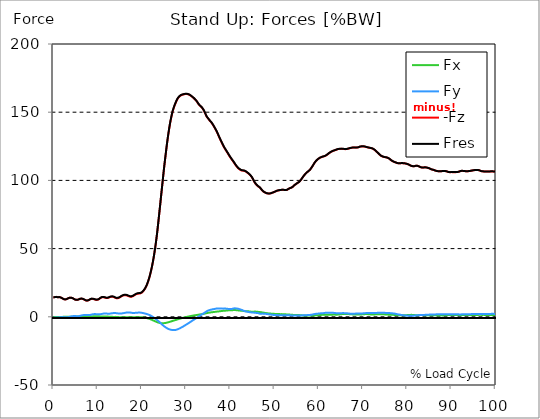
| Category |  Fx |  Fy |  -Fz |  Fres |
|---|---|---|---|---|
| 0.0 | -0.107 | -0.724 | 14.162 | 14.188 |
| 0.167348456675344 | -0.114 | -0.683 | 14.264 | 14.287 |
| 0.334696913350688 | -0.144 | -0.649 | 14.45 | 14.47 |
| 0.5020453700260321 | -0.171 | -0.605 | 14.592 | 14.609 |
| 0.669393826701376 | -0.187 | -0.534 | 14.599 | 14.614 |
| 0.83674228337672 | -0.166 | -0.531 | 14.439 | 14.454 |
| 1.0040907400520642 | -0.154 | -0.533 | 14.33 | 14.344 |
| 1.1621420602454444 | -0.182 | -0.474 | 14.438 | 14.451 |
| 1.3294905169207885 | -0.199 | -0.408 | 14.47 | 14.481 |
| 1.4968389735961325 | -0.197 | -0.34 | 14.371 | 14.381 |
| 1.6641874302714765 | -0.179 | -0.288 | 14.18 | 14.189 |
| 1.8315358869468206 | -0.147 | -0.26 | 13.936 | 13.944 |
| 1.9988843436221646 | -0.1 | -0.221 | 13.594 | 13.601 |
| 2.1662328002975086 | -0.04 | -0.238 | 13.245 | 13.251 |
| 2.333581256972853 | 0.018 | -0.288 | 12.956 | 12.964 |
| 2.5009297136481967 | 0.063 | -0.363 | 12.768 | 12.779 |
| 2.6682781703235405 | 0.088 | -0.407 | 12.723 | 12.736 |
| 2.8356266269988843 | 0.109 | -0.44 | 12.802 | 12.815 |
| 3.002975083674229 | 0.114 | -0.424 | 12.967 | 12.981 |
| 3.1703235403495724 | 0.109 | -0.379 | 13.236 | 13.249 |
| 3.337671997024917 | 0.078 | -0.276 | 13.558 | 13.568 |
| 3.4957233172182973 | 0.043 | -0.164 | 13.837 | 13.845 |
| 3.663071773893641 | 0.021 | -0.018 | 13.981 | 13.989 |
| 3.8304202305689854 | 0.006 | 0.131 | 14.072 | 14.079 |
| 3.997768687244329 | 0.004 | 0.26 | 14.024 | 14.035 |
| 4.165117143919673 | 0.011 | 0.356 | 13.891 | 13.903 |
| 4.332465600595017 | 0.025 | 0.455 | 13.682 | 13.698 |
| 4.499814057270361 | 0.049 | 0.512 | 13.402 | 13.421 |
| 4.667162513945706 | 0.089 | 0.543 | 13.047 | 13.071 |
| 4.834510970621049 | 0.129 | 0.554 | 12.739 | 12.766 |
| 5.001859427296393 | 0.166 | 0.518 | 12.52 | 12.547 |
| 5.169207883971737 | 0.201 | 0.472 | 12.37 | 12.397 |
| 5.336556340647081 | 0.222 | 0.436 | 12.383 | 12.411 |
| 5.503904797322425 | 0.231 | 0.418 | 12.464 | 12.493 |
| 5.671253253997769 | 0.235 | 0.438 | 12.632 | 12.663 |
| 5.82930457419115 | 0.22 | 0.526 | 12.882 | 12.917 |
| 5.996653030866494 | 0.202 | 0.669 | 13.136 | 13.181 |
| 6.164001487541838 | 0.184 | 0.813 | 13.264 | 13.319 |
| 6.331349944217181 | 0.17 | 0.947 | 13.323 | 13.385 |
| 6.498698400892526 | 0.173 | 1.074 | 13.236 | 13.307 |
| 6.66604685756787 | 0.183 | 1.193 | 13.105 | 13.186 |
| 6.833395314243213 | 0.204 | 1.268 | 12.893 | 12.983 |
| 7.000743770918558 | 0.237 | 1.333 | 12.607 | 12.702 |
| 7.168092227593902 | 0.278 | 1.326 | 12.28 | 12.377 |
| 7.335440684269246 | 0.317 | 1.312 | 11.971 | 12.069 |
| 7.50278914094459 | 0.337 | 1.28 | 11.872 | 11.968 |
| 7.6701375976199335 | 0.347 | 1.239 | 11.86 | 11.953 |
| 7.837486054295278 | 0.353 | 1.253 | 11.959 | 12.05 |
| 7.995537374488658 | 0.352 | 1.25 | 12.182 | 12.272 |
| 8.162885831164003 | 0.339 | 1.294 | 12.497 | 12.591 |
| 8.330234287839346 | 0.319 | 1.399 | 12.842 | 12.945 |
| 8.49758274451469 | 0.303 | 1.521 | 13.114 | 13.23 |
| 8.664931201190035 | 0.305 | 1.652 | 13.19 | 13.322 |
| 8.832279657865378 | 0.307 | 1.779 | 13.176 | 13.325 |
| 8.999628114540721 | 0.317 | 1.887 | 13.098 | 13.264 |
| 9.166976571216066 | 0.328 | 1.962 | 12.948 | 13.127 |
| 9.334325027891412 | 0.346 | 2.001 | 12.732 | 12.919 |
| 9.501673484566755 | 0.36 | 1.984 | 12.499 | 12.687 |
| 9.669021941242098 | 0.366 | 1.95 | 12.393 | 12.578 |
| 9.836370397917442 | 0.371 | 1.895 | 12.356 | 12.534 |
| 10.003718854592787 | 0.366 | 1.864 | 12.453 | 12.626 |
| 10.17106731126813 | 0.35 | 1.839 | 12.673 | 12.84 |
| 10.329118631461512 | 0.331 | 1.845 | 12.986 | 13.155 |
| 10.496467088136853 | 0.308 | 1.862 | 13.392 | 13.56 |
| 10.663815544812199 | 0.28 | 1.9 | 13.822 | 13.995 |
| 10.831164001487544 | 0.259 | 1.993 | 14.116 | 14.297 |
| 10.998512458162887 | 0.243 | 2.107 | 14.289 | 14.484 |
| 11.16586091483823 | 0.239 | 2.23 | 14.353 | 14.566 |
| 11.333209371513574 | 0.24 | 2.332 | 14.329 | 14.557 |
| 11.50055782818892 | 0.242 | 2.404 | 14.236 | 14.478 |
| 11.667906284864264 | 0.246 | 2.43 | 14.051 | 14.302 |
| 11.835254741539607 | 0.24 | 2.417 | 13.871 | 14.122 |
| 12.00260319821495 | 0.225 | 2.379 | 13.75 | 13.996 |
| 12.169951654890292 | 0.199 | 2.313 | 13.757 | 13.989 |
| 12.337300111565641 | 0.165 | 2.271 | 13.85 | 14.07 |
| 12.504648568240984 | 0.124 | 2.261 | 14.032 | 14.245 |
| 12.662699888434362 | 0.08 | 2.279 | 14.3 | 14.51 |
| 12.830048345109708 | 0.036 | 2.354 | 14.518 | 14.737 |
| 12.997396801785053 | -0.006 | 2.441 | 14.694 | 14.926 |
| 13.164745258460396 | -0.036 | 2.539 | 14.778 | 15.027 |
| 13.33209371513574 | -0.05 | 2.63 | 14.747 | 15.014 |
| 13.499442171811083 | -0.06 | 2.705 | 14.644 | 14.929 |
| 13.666790628486426 | -0.073 | 2.755 | 14.468 | 14.767 |
| 13.834139085161771 | -0.067 | 2.782 | 14.204 | 14.511 |
| 14.001487541837117 | -0.051 | 2.762 | 13.888 | 14.195 |
| 14.16883599851246 | -0.066 | 2.686 | 13.68 | 13.979 |
| 14.336184455187803 | -0.107 | 2.622 | 13.564 | 13.856 |
| 14.503532911863147 | -0.157 | 2.536 | 13.601 | 13.881 |
| 14.670881368538492 | -0.207 | 2.452 | 13.707 | 13.976 |
| 14.828932688731873 | -0.253 | 2.39 | 13.923 | 14.181 |
| 14.996281145407215 | -0.293 | 2.351 | 14.206 | 14.456 |
| 15.163629602082558 | -0.317 | 2.364 | 14.553 | 14.805 |
| 15.330978058757903 | -0.356 | 2.414 | 14.929 | 15.186 |
| 15.498326515433247 | -0.384 | 2.487 | 15.236 | 15.5 |
| 15.665674972108594 | -0.404 | 2.572 | 15.502 | 15.775 |
| 15.833023428783937 | -0.407 | 2.683 | 15.725 | 16.015 |
| 16.00037188545928 | -0.412 | 2.788 | 15.853 | 16.156 |
| 16.167720342134626 | -0.405 | 2.9 | 15.889 | 16.212 |
| 16.335068798809967 | -0.392 | 2.995 | 15.864 | 16.205 |
| 16.502417255485312 | -0.368 | 3.083 | 15.767 | 16.125 |
| 16.669765712160658 | -0.344 | 3.157 | 15.595 | 15.971 |
| 16.837114168836 | -0.319 | 3.192 | 15.365 | 15.752 |
| 17.004462625511344 | -0.29 | 3.204 | 15.104 | 15.495 |
| 17.16251394570472 | -0.264 | 3.184 | 14.851 | 15.243 |
| 17.32986240238007 | -0.257 | 3.145 | 14.732 | 15.123 |
| 17.497210859055414 | -0.264 | 3.051 | 14.672 | 15.05 |
| 17.664559315730756 | -0.284 | 2.952 | 14.734 | 15.095 |
| 17.8319077724061 | -0.311 | 2.855 | 14.872 | 15.212 |
| 17.999256229081443 | -0.336 | 2.776 | 15.128 | 15.453 |
| 18.166604685756788 | -0.356 | 2.754 | 15.432 | 15.746 |
| 18.333953142432133 | -0.355 | 2.813 | 15.843 | 16.16 |
| 18.501301599107478 | -0.344 | 2.897 | 16.229 | 16.553 |
| 18.668650055782823 | -0.328 | 2.974 | 16.479 | 16.814 |
| 18.835998512458165 | -0.325 | 3.001 | 16.716 | 17.059 |
| 19.00334696913351 | -0.32 | 3.04 | 16.891 | 17.243 |
| 19.170695425808855 | -0.3 | 3.096 | 16.984 | 17.346 |
| 19.338043882484197 | -0.287 | 3.092 | 17.035 | 17.393 |
| 19.496095202677576 | -0.275 | 3.08 | 17.082 | 17.436 |
| 19.66344365935292 | -0.307 | 3.074 | 17.155 | 17.506 |
| 19.830792116028263 | -0.35 | 3.019 | 17.39 | 17.726 |
| 19.998140572703612 | -0.396 | 2.914 | 17.741 | 18.057 |
| 20.165489029378953 | -0.454 | 2.8 | 18.201 | 18.492 |
| 20.3328374860543 | -0.51 | 2.693 | 18.8 | 19.064 |
| 20.500185942729644 | -0.586 | 2.578 | 19.53 | 19.777 |
| 20.667534399404985 | -0.674 | 2.451 | 20.315 | 20.545 |
| 20.83488285608033 | -0.765 | 2.307 | 21.25 | 21.463 |
| 21.002231312755672 | -0.875 | 2.15 | 22.345 | 22.537 |
| 21.16957976943102 | -1.004 | 1.984 | 23.607 | 23.783 |
| 21.336928226106362 | -1.149 | 1.81 | 25.041 | 25.205 |
| 21.504276682781704 | -1.296 | 1.621 | 26.634 | 26.787 |
| 21.67162513945705 | -1.455 | 1.403 | 28.361 | 28.509 |
| 21.82967645965043 | -1.653 | 1.145 | 30.327 | 30.47 |
| 21.997024916325774 | -1.867 | 0.865 | 32.496 | 32.631 |
| 22.16437337300112 | -2.087 | 0.571 | 34.826 | 34.957 |
| 22.33172182967646 | -2.321 | 0.25 | 37.413 | 37.546 |
| 22.499070286351806 | -2.561 | -0.086 | 40.174 | 40.31 |
| 22.666418743027148 | -2.801 | -0.45 | 43.21 | 43.353 |
| 22.833767199702496 | -3.042 | -0.839 | 46.479 | 46.634 |
| 23.00111565637784 | -3.277 | -1.247 | 50.039 | 50.207 |
| 23.168464113053183 | -3.505 | -1.661 | 53.863 | 54.044 |
| 23.335812569728528 | -3.731 | -2.083 | 58.004 | 58.201 |
| 23.50316102640387 | -3.953 | -2.521 | 62.384 | 62.596 |
| 23.670509483079215 | -4.155 | -2.969 | 67.323 | 67.551 |
| 23.83785793975456 | -4.324 | -3.394 | 72.265 | 72.507 |
| 23.995909259947936 | -4.481 | -3.869 | 77.372 | 77.632 |
| 24.163257716623285 | -4.595 | -4.35 | 82.453 | 82.73 |
| 24.330606173298627 | -4.657 | -4.87 | 87.71 | 88.002 |
| 24.49795462997397 | -4.702 | -5.394 | 92.769 | 93.077 |
| 24.665303086649313 | -4.711 | -5.921 | 97.841 | 98.164 |
| 24.83265154332466 | -4.702 | -6.374 | 103.005 | 103.337 |
| 25.0 | -4.672 | -6.836 | 108.074 | 108.418 |
| 25.167348456675345 | -4.607 | -7.247 | 112.791 | 113.144 |
| 25.334696913350694 | -4.523 | -7.628 | 117.275 | 117.635 |
| 25.502045370026035 | -4.398 | -7.985 | 121.735 | 122.1 |
| 25.669393826701377 | -4.278 | -8.31 | 126.048 | 126.417 |
| 25.836742283376722 | -4.154 | -8.611 | 130.144 | 130.517 |
| 26.004090740052067 | -4.02 | -8.873 | 133.924 | 134.3 |
| 26.17143919672741 | -3.864 | -9.097 | 137.417 | 137.793 |
| 26.329490516920792 | -3.692 | -9.294 | 140.677 | 141.054 |
| 26.49683897359613 | -3.517 | -9.459 | 143.687 | 144.064 |
| 26.66418743027148 | -3.34 | -9.566 | 146.284 | 146.659 |
| 26.831535886946828 | -3.163 | -9.659 | 148.681 | 149.054 |
| 26.998884343622166 | -2.986 | -9.745 | 150.874 | 151.244 |
| 27.166232800297514 | -2.818 | -9.782 | 152.627 | 152.993 |
| 27.333581256972852 | -2.653 | -9.754 | 154.173 | 154.532 |
| 27.5009297136482 | -2.49 | -9.717 | 155.607 | 155.96 |
| 27.668278170323543 | -2.326 | -9.609 | 156.907 | 157.248 |
| 27.835626626998888 | -2.173 | -9.469 | 158.165 | 158.493 |
| 28.002975083674233 | -1.987 | -9.266 | 159.279 | 159.591 |
| 28.170323540349575 | -1.809 | -9.051 | 160.22 | 160.518 |
| 28.33767199702492 | -1.64 | -8.832 | 160.962 | 161.248 |
| 28.50502045370026 | -1.475 | -8.598 | 161.542 | 161.816 |
| 28.663071773893645 | -1.307 | -8.307 | 162.004 | 162.266 |
| 28.830420230568986 | -1.151 | -8.033 | 162.324 | 162.573 |
| 28.99776868724433 | -1.003 | -7.736 | 162.607 | 162.845 |
| 29.165117143919673 | -0.866 | -7.45 | 162.785 | 163.013 |
| 29.33246560059502 | -0.721 | -7.134 | 162.945 | 163.164 |
| 29.499814057270367 | -0.585 | -6.795 | 163.099 | 163.313 |
| 29.66716251394571 | -0.457 | -6.45 | 163.221 | 163.433 |
| 29.834510970621054 | -0.326 | -6.131 | 163.306 | 163.514 |
| 30.00185942729639 | -0.18 | -5.797 | 163.324 | 163.523 |
| 30.169207883971744 | -0.05 | -5.464 | 163.315 | 163.507 |
| 30.33655634064708 | 0.065 | -5.13 | 163.236 | 163.426 |
| 30.50390479732243 | 0.163 | -4.822 | 163.102 | 163.29 |
| 30.671253253997772 | 0.279 | -4.457 | 162.893 | 163.073 |
| 30.829304574191156 | 0.377 | -4.116 | 162.647 | 162.82 |
| 30.996653030866494 | 0.51 | -3.76 | 162.246 | 162.412 |
| 31.164001487541842 | 0.621 | -3.368 | 161.869 | 162.029 |
| 31.331349944217187 | 0.733 | -3.007 | 161.469 | 161.63 |
| 31.498698400892525 | 0.837 | -2.641 | 161.032 | 161.194 |
| 31.666046857567874 | 0.929 | -2.307 | 160.559 | 160.725 |
| 31.833395314243212 | 1.007 | -2.018 | 160.063 | 160.234 |
| 32.00074377091856 | 1.107 | -1.67 | 159.456 | 159.621 |
| 32.1680922275939 | 1.202 | -1.25 | 158.899 | 159.063 |
| 32.33544068426925 | 1.299 | -0.869 | 158.379 | 158.546 |
| 32.50278914094459 | 1.374 | -0.572 | 157.595 | 157.761 |
| 32.670137597619934 | 1.439 | -0.211 | 156.664 | 156.828 |
| 32.83748605429528 | 1.542 | 0.19 | 155.898 | 156.06 |
| 33.004834510970625 | 1.649 | 0.592 | 155.262 | 155.423 |
| 33.162885831164004 | 1.738 | 0.953 | 154.708 | 154.879 |
| 33.33023428783935 | 1.814 | 1.299 | 154.262 | 154.446 |
| 33.497582744514695 | 1.894 | 1.639 | 153.72 | 153.912 |
| 33.664931201190036 | 1.98 | 1.964 | 152.979 | 153.178 |
| 33.83227965786538 | 2.064 | 2.282 | 152.209 | 152.417 |
| 33.99962811454073 | 2.15 | 2.587 | 151.393 | 151.608 |
| 34.16697657121607 | 2.286 | 2.914 | 150.268 | 150.479 |
| 34.33432502789141 | 2.429 | 3.263 | 149.05 | 149.251 |
| 34.50167348456676 | 2.577 | 3.621 | 147.895 | 148.086 |
| 34.6690219412421 | 2.714 | 3.999 | 146.818 | 147.001 |
| 34.83637039791744 | 2.825 | 4.349 | 145.958 | 146.141 |
| 35.00371885459279 | 2.899 | 4.564 | 145.308 | 145.502 |
| 35.17106731126814 | 2.983 | 4.731 | 144.646 | 144.85 |
| 35.338415767943474 | 3.106 | 4.975 | 143.887 | 144.096 |
| 35.49646708813686 | 3.201 | 5.11 | 143.283 | 143.498 |
| 35.6638155448122 | 3.271 | 5.219 | 142.705 | 142.922 |
| 35.831164001487544 | 3.333 | 5.364 | 141.937 | 142.159 |
| 35.998512458162885 | 3.395 | 5.509 | 141.169 | 141.395 |
| 36.165860914838234 | 3.465 | 5.586 | 140.284 | 140.518 |
| 36.333209371513576 | 3.539 | 5.677 | 139.364 | 139.604 |
| 36.50055782818892 | 3.614 | 5.818 | 138.403 | 138.647 |
| 36.667906284864266 | 3.688 | 5.921 | 137.421 | 137.669 |
| 36.83525474153961 | 3.762 | 6.028 | 136.407 | 136.661 |
| 37.002603198214956 | 3.822 | 6.121 | 135.339 | 135.6 |
| 37.1699516548903 | 3.867 | 6.129 | 134.131 | 134.396 |
| 37.337300111565646 | 3.919 | 6.131 | 132.876 | 133.145 |
| 37.50464856824098 | 3.988 | 6.121 | 131.652 | 131.926 |
| 37.66269988843437 | 4.077 | 6.098 | 130.462 | 130.739 |
| 37.83004834510971 | 4.16 | 6.075 | 129.295 | 129.579 |
| 37.99739680178505 | 4.229 | 6.045 | 128.192 | 128.479 |
| 38.16474525846039 | 4.313 | 6.012 | 127.014 | 127.307 |
| 38.33209371513574 | 4.358 | 5.983 | 125.913 | 126.207 |
| 38.49944217181109 | 4.404 | 5.988 | 124.859 | 125.154 |
| 38.666790628486424 | 4.45 | 6.008 | 123.894 | 124.19 |
| 38.83413908516178 | 4.492 | 6.026 | 122.989 | 123.287 |
| 39.001487541837115 | 4.538 | 6.005 | 122.12 | 122.42 |
| 39.16883599851246 | 4.593 | 5.934 | 121.258 | 121.559 |
| 39.336184455187805 | 4.629 | 5.839 | 120.404 | 120.706 |
| 39.503532911863154 | 4.705 | 5.793 | 119.524 | 119.831 |
| 39.670881368538495 | 4.764 | 5.782 | 118.627 | 118.937 |
| 39.83822982521384 | 4.793 | 5.782 | 117.739 | 118.05 |
| 39.996281145407224 | 4.809 | 5.78 | 116.908 | 117.218 |
| 40.163629602082565 | 4.81 | 5.756 | 116.136 | 116.443 |
| 40.33097805875791 | 4.807 | 5.724 | 115.383 | 115.689 |
| 40.498326515433256 | 4.831 | 5.805 | 114.606 | 114.912 |
| 40.6656749721086 | 4.919 | 6.044 | 113.856 | 114.169 |
| 40.83302342878393 | 4.949 | 6.183 | 113.143 | 113.462 |
| 41.00037188545929 | 4.95 | 6.215 | 112.239 | 112.563 |
| 41.16772034213463 | 4.921 | 6.183 | 111.413 | 111.739 |
| 41.33506879880997 | 4.868 | 6.138 | 110.68 | 111.006 |
| 41.50241725548531 | 4.821 | 6.097 | 109.945 | 110.269 |
| 41.66976571216066 | 4.731 | 5.979 | 109.338 | 109.658 |
| 41.837114168836 | 4.683 | 5.861 | 108.759 | 109.073 |
| 42.004462625511344 | 4.636 | 5.707 | 108.343 | 108.652 |
| 42.17181108218669 | 4.569 | 5.516 | 107.979 | 108.282 |
| 42.32986240238007 | 4.5 | 5.305 | 107.684 | 107.979 |
| 42.497210859055414 | 4.469 | 5.168 | 107.31 | 107.599 |
| 42.66455931573076 | 4.409 | 4.949 | 107.221 | 107.497 |
| 42.831907772406105 | 4.347 | 4.712 | 107.156 | 107.42 |
| 42.999256229081446 | 4.284 | 4.479 | 107.088 | 107.338 |
| 43.16660468575679 | 4.206 | 4.286 | 106.984 | 107.225 |
| 43.33395314243214 | 4.128 | 4.093 | 106.88 | 107.112 |
| 43.50130159910748 | 4.101 | 3.97 | 106.536 | 106.763 |
| 43.66865005578282 | 4.082 | 3.859 | 106.153 | 106.378 |
| 43.83599851245817 | 4.073 | 3.734 | 105.736 | 105.956 |
| 44.00334696913351 | 4.064 | 3.607 | 105.312 | 105.529 |
| 44.17069542580886 | 3.993 | 3.497 | 104.893 | 105.105 |
| 44.3380438824842 | 3.913 | 3.408 | 104.433 | 104.641 |
| 44.49609520267758 | 3.844 | 3.334 | 103.88 | 104.087 |
| 44.66344365935292 | 3.78 | 3.267 | 103.262 | 103.466 |
| 44.83079211602827 | 3.73 | 3.216 | 102.515 | 102.718 |
| 44.99814057270361 | 3.707 | 3.177 | 101.635 | 101.84 |
| 45.16548902937895 | 3.738 | 3.134 | 100.671 | 100.88 |
| 45.332837486054295 | 3.787 | 3.056 | 99.532 | 99.742 |
| 45.500185942729644 | 3.821 | 2.982 | 98.588 | 98.798 |
| 45.66753439940499 | 3.811 | 2.913 | 97.775 | 97.982 |
| 45.83488285608033 | 3.758 | 2.84 | 97.057 | 97.258 |
| 46.00223131275568 | 3.701 | 2.825 | 96.453 | 96.65 |
| 46.16957976943102 | 3.64 | 2.782 | 95.927 | 96.118 |
| 46.336928226106366 | 3.607 | 2.655 | 95.574 | 95.753 |
| 46.50427668278171 | 3.554 | 2.451 | 95.221 | 95.384 |
| 46.671625139457056 | 3.506 | 2.283 | 94.784 | 94.935 |
| 46.829676459650436 | 3.436 | 2.189 | 94.257 | 94.397 |
| 46.99702491632577 | 3.332 | 2.234 | 93.553 | 93.686 |
| 47.16437337300112 | 3.232 | 2.352 | 92.782 | 92.908 |
| 47.33172182967646 | 3.136 | 2.343 | 92.25 | 92.37 |
| 47.49907028635181 | 3.041 | 2.319 | 91.815 | 91.931 |
| 47.66641874302716 | 2.948 | 2.287 | 91.458 | 91.57 |
| 47.83376719970249 | 2.861 | 2.229 | 91.12 | 91.227 |
| 48.001115656377834 | 2.772 | 2.166 | 90.815 | 90.918 |
| 48.16846411305319 | 2.675 | 2.085 | 90.624 | 90.721 |
| 48.33581256972853 | 2.592 | 2.067 | 90.482 | 90.576 |
| 48.50316102640387 | 2.532 | 1.963 | 90.391 | 90.479 |
| 48.67050948307921 | 2.479 | 1.861 | 90.335 | 90.419 |
| 48.837857939754564 | 2.437 | 1.764 | 90.334 | 90.415 |
| 49.005206396429905 | 2.393 | 1.675 | 90.366 | 90.446 |
| 49.163257716623285 | 2.341 | 1.614 | 90.5 | 90.577 |
| 49.33060617329863 | 2.284 | 1.555 | 90.693 | 90.766 |
| 49.49795462997397 | 2.239 | 1.488 | 90.936 | 91.006 |
| 49.66530308664932 | 2.213 | 1.413 | 91.155 | 91.224 |
| 49.832651543324666 | 2.151 | 1.36 | 91.306 | 91.372 |
| 50.0 | 2.141 | 1.342 | 91.573 | 91.638 |
| 50.16734845667534 | 2.102 | 1.301 | 91.827 | 91.892 |
| 50.33469691335069 | 2.1 | 1.288 | 92.108 | 92.175 |
| 50.50204537002604 | 2.103 | 1.27 | 92.349 | 92.414 |
| 50.66939382670139 | 2.086 | 1.227 | 92.485 | 92.55 |
| 50.836742283376715 | 2.049 | 1.181 | 92.631 | 92.696 |
| 51.00409074005207 | 2.016 | 1.154 | 92.849 | 92.914 |
| 51.17143919672741 | 1.986 | 1.129 | 92.839 | 92.905 |
| 51.32949051692079 | 1.938 | 1.14 | 92.821 | 92.886 |
| 51.496838973596134 | 1.936 | 1.131 | 92.988 | 93.051 |
| 51.66418743027148 | 1.964 | 1.13 | 93.109 | 93.173 |
| 51.831535886946824 | 1.921 | 1.136 | 93.18 | 93.243 |
| 51.99888434362217 | 1.895 | 1.157 | 93.092 | 93.152 |
| 52.16623280029752 | 1.865 | 1.179 | 92.999 | 93.056 |
| 52.33358125697285 | 1.835 | 1.21 | 92.949 | 93.004 |
| 52.5009297136482 | 1.804 | 1.246 | 92.922 | 92.973 |
| 52.668278170323546 | 1.779 | 1.211 | 92.919 | 92.965 |
| 52.835626626998895 | 1.735 | 1.136 | 93.069 | 93.113 |
| 53.00297508367424 | 1.671 | 1.094 | 93.385 | 93.427 |
| 53.17032354034958 | 1.618 | 1.097 | 93.764 | 93.804 |
| 53.33767199702492 | 1.611 | 1.144 | 94.116 | 94.153 |
| 53.50502045370027 | 1.597 | 1.102 | 94.343 | 94.379 |
| 53.663071773893655 | 1.567 | 1.049 | 94.491 | 94.524 |
| 53.83042023056899 | 1.532 | 1.014 | 94.679 | 94.712 |
| 53.99776868724433 | 1.476 | 1.004 | 94.989 | 95.021 |
| 54.16511714391967 | 1.408 | 0.997 | 95.402 | 95.434 |
| 54.33246560059503 | 1.348 | 1.022 | 95.915 | 95.946 |
| 54.49981405727037 | 1.301 | 1.045 | 96.492 | 96.521 |
| 54.667162513945705 | 1.287 | 1.025 | 96.899 | 96.93 |
| 54.834510970621054 | 1.258 | 0.979 | 97.257 | 97.288 |
| 55.0018594272964 | 1.228 | 0.959 | 97.686 | 97.717 |
| 55.169207883971744 | 1.227 | 0.955 | 98.057 | 98.088 |
| 55.336556340647086 | 1.272 | 0.968 | 98.301 | 98.333 |
| 55.50390479732243 | 1.265 | 0.97 | 98.707 | 98.738 |
| 55.671253253997776 | 1.239 | 0.993 | 99.236 | 99.268 |
| 55.83860171067312 | 1.163 | 0.999 | 99.859 | 99.889 |
| 55.9966530308665 | 1.079 | 0.996 | 100.468 | 100.498 |
| 56.16400148754184 | 1.028 | 1.017 | 101.256 | 101.286 |
| 56.33134994421718 | 1.028 | 1.059 | 102.052 | 102.083 |
| 56.498698400892536 | 1.036 | 1.119 | 102.833 | 102.864 |
| 56.66604685756788 | 1.026 | 1.172 | 103.582 | 103.615 |
| 56.83339531424321 | 0.996 | 1.183 | 104.228 | 104.262 |
| 57.00074377091856 | 0.987 | 1.195 | 104.807 | 104.841 |
| 57.16809222759391 | 0.959 | 1.2 | 105.354 | 105.388 |
| 57.33544068426925 | 0.935 | 1.227 | 105.882 | 105.916 |
| 57.5027891409446 | 0.913 | 1.267 | 106.398 | 106.432 |
| 57.670137597619934 | 0.949 | 1.312 | 106.778 | 106.812 |
| 57.83748605429528 | 0.944 | 1.343 | 107.179 | 107.213 |
| 58.004834510970625 | 0.907 | 1.364 | 107.706 | 107.742 |
| 58.16288583116401 | 0.892 | 1.403 | 108.337 | 108.376 |
| 58.330234287839346 | 0.875 | 1.488 | 109.163 | 109.203 |
| 58.497582744514695 | 0.925 | 1.613 | 109.987 | 110.033 |
| 58.66493120119004 | 0.992 | 1.749 | 110.811 | 110.864 |
| 58.832279657865385 | 1.011 | 1.85 | 111.695 | 111.751 |
| 58.999628114540734 | 1.01 | 1.936 | 112.602 | 112.661 |
| 59.16697657121607 | 1.048 | 2.055 | 113.336 | 113.399 |
| 59.33432502789142 | 1.069 | 2.153 | 114.08 | 114.149 |
| 59.50167348456676 | 1.096 | 2.215 | 114.633 | 114.703 |
| 59.66902194124211 | 1.133 | 2.266 | 115.145 | 115.22 |
| 59.83637039791745 | 1.179 | 2.331 | 115.604 | 115.681 |
| 60.00371885459278 | 1.224 | 2.395 | 116.023 | 116.104 |
| 60.17106731126813 | 1.276 | 2.453 | 116.391 | 116.474 |
| 60.33841576794349 | 1.332 | 2.508 | 116.669 | 116.755 |
| 60.49646708813685 | 1.379 | 2.567 | 116.928 | 117.018 |
| 60.6638155448122 | 1.423 | 2.601 | 117.133 | 117.224 |
| 60.831164001487544 | 1.436 | 2.606 | 117.31 | 117.403 |
| 60.99851245816289 | 1.472 | 2.65 | 117.483 | 117.577 |
| 61.16586091483824 | 1.53 | 2.752 | 117.63 | 117.727 |
| 61.333209371513576 | 1.573 | 2.848 | 117.785 | 117.885 |
| 61.50055782818892 | 1.55 | 2.902 | 118.007 | 118.108 |
| 61.667906284864266 | 1.496 | 2.94 | 118.328 | 118.429 |
| 61.835254741539615 | 1.46 | 2.946 | 118.674 | 118.775 |
| 62.002603198214956 | 1.421 | 2.945 | 119.111 | 119.213 |
| 62.16995165489029 | 1.412 | 2.933 | 119.567 | 119.67 |
| 62.33730011156564 | 1.417 | 2.93 | 119.962 | 120.065 |
| 62.504648568240995 | 1.422 | 2.938 | 120.308 | 120.414 |
| 62.67199702491633 | 1.462 | 2.896 | 120.704 | 120.812 |
| 62.83004834510971 | 1.507 | 2.883 | 121.016 | 121.125 |
| 62.99739680178505 | 1.55 | 2.879 | 121.282 | 121.393 |
| 63.1647452584604 | 1.593 | 2.871 | 121.538 | 121.65 |
| 63.33209371513575 | 1.636 | 2.884 | 121.747 | 121.859 |
| 63.4994421718111 | 1.65 | 2.848 | 121.899 | 122.009 |
| 63.666790628486424 | 1.612 | 2.771 | 122.084 | 122.189 |
| 63.83413908516177 | 1.575 | 2.682 | 122.303 | 122.402 |
| 64.00148754183712 | 1.549 | 2.597 | 122.536 | 122.63 |
| 64.16883599851248 | 1.554 | 2.548 | 122.76 | 122.85 |
| 64.3361844551878 | 1.607 | 2.562 | 122.92 | 123.011 |
| 64.50353291186315 | 1.658 | 2.58 | 123.011 | 123.104 |
| 64.6708813685385 | 1.718 | 2.598 | 123.063 | 123.157 |
| 64.83822982521384 | 1.782 | 2.616 | 123.105 | 123.201 |
| 65.00557828188919 | 1.853 | 2.645 | 123.122 | 123.221 |
| 65.16362960208257 | 1.925 | 2.675 | 123.136 | 123.237 |
| 65.3309780587579 | 2.008 | 2.693 | 123.124 | 123.228 |
| 65.49832651543326 | 2.062 | 2.699 | 123.089 | 123.194 |
| 65.6656749721086 | 2.093 | 2.696 | 123.024 | 123.131 |
| 65.83302342878395 | 2.12 | 2.679 | 122.96 | 123.066 |
| 66.00037188545929 | 2.146 | 2.662 | 122.896 | 123.003 |
| 66.16772034213463 | 2.122 | 2.628 | 122.906 | 123.011 |
| 66.33506879880998 | 2.103 | 2.582 | 122.986 | 123.091 |
| 66.50241725548531 | 2.071 | 2.524 | 123.107 | 123.207 |
| 66.66976571216065 | 2.034 | 2.467 | 123.258 | 123.357 |
| 66.83711416883601 | 1.967 | 2.388 | 123.412 | 123.507 |
| 67.00446262551135 | 1.916 | 2.328 | 123.569 | 123.661 |
| 67.1718110821867 | 1.884 | 2.296 | 123.728 | 123.82 |
| 67.32986240238007 | 1.845 | 2.275 | 123.835 | 123.924 |
| 67.49721085905541 | 1.799 | 2.272 | 123.939 | 124.029 |
| 67.66455931573076 | 1.756 | 2.272 | 124.036 | 124.126 |
| 67.83190777240611 | 1.734 | 2.285 | 124.079 | 124.17 |
| 67.99925622908145 | 1.729 | 2.299 | 124.081 | 124.172 |
| 68.16660468575678 | 1.736 | 2.315 | 124.052 | 124.145 |
| 68.33395314243214 | 1.742 | 2.332 | 124.023 | 124.116 |
| 68.50130159910749 | 1.749 | 2.349 | 123.993 | 124.088 |
| 68.66865005578282 | 1.75 | 2.364 | 124.042 | 124.136 |
| 68.83599851245816 | 1.738 | 2.364 | 124.136 | 124.229 |
| 69.00334696913352 | 1.709 | 2.352 | 124.277 | 124.368 |
| 69.17069542580886 | 1.679 | 2.354 | 124.484 | 124.575 |
| 69.3380438824842 | 1.66 | 2.359 | 124.734 | 124.825 |
| 69.50539233915956 | 1.7 | 2.38 | 124.835 | 124.928 |
| 69.66344365935292 | 1.75 | 2.413 | 124.892 | 124.986 |
| 69.83079211602826 | 1.793 | 2.459 | 124.949 | 125.044 |
| 69.99814057270362 | 1.835 | 2.518 | 124.949 | 125.045 |
| 70.16548902937896 | 1.877 | 2.585 | 124.909 | 125.008 |
| 70.33283748605429 | 1.927 | 2.64 | 124.827 | 124.928 |
| 70.50018594272964 | 1.99 | 2.679 | 124.69 | 124.793 |
| 70.667534399405 | 2.01 | 2.707 | 124.541 | 124.645 |
| 70.83488285608033 | 2.005 | 2.731 | 124.387 | 124.489 |
| 71.00223131275568 | 2 | 2.753 | 124.233 | 124.334 |
| 71.16957976943102 | 1.947 | 2.75 | 124.114 | 124.211 |
| 71.33692822610637 | 1.893 | 2.747 | 123.996 | 124.091 |
| 71.50427668278171 | 1.834 | 2.74 | 123.882 | 123.973 |
| 71.67162513945706 | 1.772 | 2.731 | 123.772 | 123.86 |
| 71.8389735961324 | 1.709 | 2.721 | 123.662 | 123.746 |
| 71.99702491632577 | 1.662 | 2.724 | 123.529 | 123.611 |
| 72.16437337300113 | 1.634 | 2.745 | 123.364 | 123.446 |
| 72.33172182967647 | 1.645 | 2.761 | 123.081 | 123.163 |
| 72.49907028635181 | 1.676 | 2.793 | 122.719 | 122.799 |
| 72.66641874302715 | 1.739 | 2.825 | 122.322 | 122.405 |
| 72.8337671997025 | 1.793 | 2.844 | 121.862 | 121.946 |
| 73.00111565637783 | 1.84 | 2.872 | 121.306 | 121.393 |
| 73.16846411305319 | 1.87 | 2.888 | 120.777 | 120.864 |
| 73.33581256972853 | 1.864 | 2.879 | 120.303 | 120.391 |
| 73.50316102640387 | 1.843 | 2.919 | 119.812 | 119.901 |
| 73.67050948307921 | 1.825 | 2.939 | 119.236 | 119.325 |
| 73.83785793975457 | 1.81 | 2.94 | 118.635 | 118.722 |
| 74.00520639642991 | 1.793 | 2.937 | 118.227 | 118.314 |
| 74.16325771662328 | 1.813 | 2.949 | 117.89 | 117.977 |
| 74.33060617329863 | 1.839 | 2.964 | 117.64 | 117.727 |
| 74.49795462997398 | 1.836 | 2.965 | 117.441 | 117.525 |
| 74.66530308664932 | 1.834 | 2.967 | 117.241 | 117.324 |
| 74.83265154332466 | 1.821 | 2.951 | 117.097 | 117.179 |
| 75.00000000000001 | 1.755 | 2.881 | 117.016 | 117.093 |
| 75.16734845667534 | 1.661 | 2.822 | 116.897 | 116.971 |
| 75.3346969133507 | 1.608 | 2.77 | 116.816 | 116.886 |
| 75.50204537002605 | 1.593 | 2.763 | 116.652 | 116.721 |
| 75.66939382670138 | 1.593 | 2.764 | 116.44 | 116.508 |
| 75.83674228337672 | 1.576 | 2.749 | 116.17 | 116.236 |
| 76.00409074005208 | 1.574 | 2.756 | 115.821 | 115.886 |
| 76.17143919672742 | 1.575 | 2.75 | 115.403 | 115.466 |
| 76.33878765340276 | 1.516 | 2.635 | 114.888 | 114.947 |
| 76.49683897359614 | 1.509 | 2.573 | 114.502 | 114.557 |
| 76.66418743027148 | 1.501 | 2.526 | 114.179 | 114.232 |
| 76.83153588694682 | 1.461 | 2.448 | 113.884 | 113.935 |
| 76.99888434362218 | 1.393 | 2.395 | 113.639 | 113.687 |
| 77.16623280029752 | 1.394 | 2.35 | 113.464 | 113.512 |
| 77.33358125697285 | 1.398 | 2.236 | 113.239 | 113.284 |
| 77.5009297136482 | 1.375 | 2.071 | 112.975 | 113.015 |
| 77.66827817032356 | 1.33 | 1.967 | 112.794 | 112.832 |
| 77.83562662699889 | 1.283 | 1.852 | 112.662 | 112.696 |
| 78.00297508367423 | 1.22 | 1.769 | 112.557 | 112.588 |
| 78.17032354034959 | 1.166 | 1.666 | 112.473 | 112.502 |
| 78.33767199702493 | 1.112 | 1.554 | 112.497 | 112.524 |
| 78.50502045370027 | 1.089 | 1.448 | 112.596 | 112.622 |
| 78.67236891037561 | 1.081 | 1.345 | 112.675 | 112.702 |
| 78.83042023056899 | 1.105 | 1.252 | 112.685 | 112.712 |
| 78.99776868724433 | 1.142 | 1.202 | 112.647 | 112.676 |
| 79.16511714391969 | 1.162 | 1.099 | 112.608 | 112.638 |
| 79.33246560059503 | 1.17 | 1.017 | 112.549 | 112.579 |
| 79.49981405727036 | 1.164 | 0.961 | 112.463 | 112.493 |
| 79.66716251394571 | 1.18 | 0.922 | 112.356 | 112.386 |
| 79.83451097062107 | 1.22 | 0.905 | 112.226 | 112.256 |
| 80.00185942729641 | 1.242 | 0.87 | 112.052 | 112.082 |
| 80.16920788397174 | 1.252 | 0.826 | 111.855 | 111.884 |
| 80.33655634064709 | 1.304 | 0.811 | 111.624 | 111.654 |
| 80.50390479732243 | 1.371 | 0.83 | 111.327 | 111.357 |
| 80.67125325399778 | 1.393 | 0.817 | 111.042 | 111.072 |
| 80.83860171067312 | 1.415 | 0.805 | 110.76 | 110.79 |
| 80.99665303086651 | 1.426 | 0.817 | 110.579 | 110.607 |
| 81.16400148754184 | 1.399 | 0.817 | 110.444 | 110.472 |
| 81.3313499442172 | 1.335 | 0.804 | 110.366 | 110.393 |
| 81.49869840089255 | 1.278 | 0.8 | 110.323 | 110.347 |
| 81.66604685756786 | 1.263 | 0.881 | 110.446 | 110.467 |
| 81.83339531424322 | 1.213 | 0.966 | 110.631 | 110.651 |
| 82.00074377091858 | 1.163 | 1.024 | 110.731 | 110.751 |
| 82.16809222759392 | 1.117 | 1.072 | 110.787 | 110.807 |
| 82.33544068426926 | 1.15 | 1.108 | 110.679 | 110.7 |
| 82.50278914094459 | 1.205 | 1.152 | 110.492 | 110.512 |
| 82.67013759761994 | 1.25 | 1.199 | 110.264 | 110.286 |
| 82.83748605429528 | 1.31 | 1.264 | 109.989 | 110.01 |
| 83.00483451097062 | 1.349 | 1.316 | 109.736 | 109.758 |
| 83.17218296764597 | 1.323 | 1.331 | 109.551 | 109.574 |
| 83.33023428783935 | 1.255 | 1.321 | 109.421 | 109.442 |
| 83.4975827445147 | 1.216 | 1.331 | 109.365 | 109.386 |
| 83.66493120119004 | 1.193 | 1.345 | 109.393 | 109.414 |
| 83.83227965786537 | 1.171 | 1.379 | 109.511 | 109.532 |
| 83.99962811454073 | 1.16 | 1.419 | 109.606 | 109.626 |
| 84.16697657121607 | 1.177 | 1.455 | 109.57 | 109.592 |
| 84.33432502789142 | 1.208 | 1.5 | 109.461 | 109.484 |
| 84.50167348456677 | 1.167 | 1.515 | 109.333 | 109.356 |
| 84.6690219412421 | 1.122 | 1.529 | 109.205 | 109.227 |
| 84.83637039791745 | 1.141 | 1.584 | 109.069 | 109.093 |
| 85.0037188545928 | 1.17 | 1.614 | 108.855 | 108.879 |
| 85.17106731126813 | 1.155 | 1.624 | 108.543 | 108.568 |
| 85.33841576794349 | 1.141 | 1.63 | 108.274 | 108.299 |
| 85.50576422461883 | 1.114 | 1.617 | 108.09 | 108.114 |
| 85.66381554481221 | 1.072 | 1.611 | 107.942 | 107.966 |
| 85.83116400148755 | 1.05 | 1.639 | 107.856 | 107.879 |
| 85.99851245816289 | 1.077 | 1.694 | 107.686 | 107.711 |
| 86.16586091483823 | 1.112 | 1.747 | 107.481 | 107.508 |
| 86.33320937151358 | 1.107 | 1.765 | 107.23 | 107.258 |
| 86.50055782818893 | 1.086 | 1.781 | 107.028 | 107.056 |
| 86.66790628486427 | 1.063 | 1.797 | 106.906 | 106.933 |
| 86.83525474153961 | 1.057 | 1.806 | 106.787 | 106.815 |
| 87.00260319821496 | 1.028 | 1.811 | 106.729 | 106.757 |
| 87.16995165489031 | 1.021 | 1.818 | 106.756 | 106.783 |
| 87.33730011156564 | 1.043 | 1.819 | 106.748 | 106.775 |
| 87.504648568241 | 1.056 | 1.812 | 106.721 | 106.749 |
| 87.67199702491634 | 1.05 | 1.816 | 106.727 | 106.755 |
| 87.83004834510972 | 1.036 | 1.824 | 106.755 | 106.783 |
| 87.99739680178506 | 1.032 | 1.856 | 106.817 | 106.845 |
| 88.1647452584604 | 1.06 | 1.872 | 106.848 | 106.877 |
| 88.33209371513574 | 1.075 | 1.877 | 106.864 | 106.893 |
| 88.49944217181108 | 1.085 | 1.87 | 106.845 | 106.874 |
| 88.66679062848644 | 1.105 | 1.88 | 106.799 | 106.828 |
| 88.83413908516178 | 1.12 | 1.885 | 106.693 | 106.723 |
| 89.00148754183712 | 1.194 | 1.893 | 106.563 | 106.592 |
| 89.16883599851246 | 1.27 | 1.895 | 106.357 | 106.386 |
| 89.33618445518782 | 1.316 | 1.881 | 106.13 | 106.16 |
| 89.50353291186315 | 1.32 | 1.864 | 106.045 | 106.075 |
| 89.6708813685385 | 1.321 | 1.85 | 106.022 | 106.052 |
| 89.83822982521386 | 1.321 | 1.838 | 106.044 | 106.075 |
| 90.00557828188919 | 1.324 | 1.827 | 106.07 | 106.1 |
| 90.16362960208257 | 1.293 | 1.793 | 106.068 | 106.097 |
| 90.3309780587579 | 1.27 | 1.781 | 106.053 | 106.082 |
| 90.49832651543326 | 1.256 | 1.78 | 106.034 | 106.063 |
| 90.66567497210859 | 1.252 | 1.779 | 106.045 | 106.075 |
| 90.83302342878395 | 1.263 | 1.782 | 106.065 | 106.095 |
| 91.00037188545929 | 1.282 | 1.792 | 106.05 | 106.079 |
| 91.16772034213463 | 1.307 | 1.814 | 106.086 | 106.118 |
| 91.33506879880998 | 1.321 | 1.821 | 106.126 | 106.158 |
| 91.50241725548533 | 1.287 | 1.804 | 106.196 | 106.228 |
| 91.66976571216065 | 1.235 | 1.783 | 106.328 | 106.359 |
| 91.83711416883601 | 1.181 | 1.764 | 106.545 | 106.576 |
| 92.00446262551137 | 1.146 | 1.752 | 106.788 | 106.82 |
| 92.1718110821867 | 1.151 | 1.765 | 106.943 | 106.975 |
| 92.33915953886203 | 1.2 | 1.79 | 107.004 | 107.036 |
| 92.49721085905541 | 1.265 | 1.809 | 106.99 | 107.024 |
| 92.66455931573077 | 1.299 | 1.815 | 106.935 | 106.97 |
| 92.83190777240611 | 1.28 | 1.823 | 106.876 | 106.91 |
| 92.99925622908145 | 1.264 | 1.833 | 106.814 | 106.849 |
| 93.1666046857568 | 1.256 | 1.844 | 106.745 | 106.779 |
| 93.33395314243214 | 1.25 | 1.861 | 106.711 | 106.747 |
| 93.50130159910749 | 1.246 | 1.884 | 106.718 | 106.754 |
| 93.66865005578283 | 1.242 | 1.907 | 106.725 | 106.762 |
| 93.83599851245818 | 1.239 | 1.915 | 106.764 | 106.801 |
| 94.00334696913353 | 1.236 | 1.921 | 106.805 | 106.841 |
| 94.17069542580886 | 1.23 | 1.93 | 106.884 | 106.921 |
| 94.3380438824842 | 1.224 | 1.945 | 106.996 | 107.034 |
| 94.50539233915954 | 1.224 | 1.966 | 107.117 | 107.154 |
| 94.66344365935292 | 1.269 | 1.988 | 107.236 | 107.276 |
| 94.83079211602828 | 1.289 | 1.994 | 107.319 | 107.358 |
| 94.99814057270362 | 1.276 | 1.973 | 107.403 | 107.441 |
| 95.16548902937897 | 1.246 | 1.965 | 107.534 | 107.571 |
| 95.33283748605432 | 1.248 | 1.999 | 107.586 | 107.624 |
| 95.50018594272963 | 1.251 | 2.015 | 107.642 | 107.681 |
| 95.66753439940499 | 1.291 | 2.013 | 107.676 | 107.715 |
| 95.83488285608034 | 1.325 | 2.02 | 107.672 | 107.712 |
| 96.00223131275567 | 1.365 | 2.045 | 107.625 | 107.666 |
| 96.16957976943102 | 1.41 | 2.055 | 107.519 | 107.562 |
| 96.33692822610638 | 1.454 | 2.057 | 107.377 | 107.42 |
| 96.50427668278171 | 1.448 | 2.037 | 107.148 | 107.191 |
| 96.67162513945706 | 1.432 | 2.008 | 106.839 | 106.882 |
| 96.8389735961324 | 1.389 | 2.007 | 106.739 | 106.781 |
| 96.99702491632577 | 1.385 | 2.025 | 106.641 | 106.684 |
| 97.16437337300111 | 1.379 | 2.04 | 106.592 | 106.635 |
| 97.33172182967647 | 1.422 | 2.07 | 106.56 | 106.605 |
| 97.49907028635181 | 1.415 | 2.065 | 106.502 | 106.547 |
| 97.66641874302715 | 1.36 | 2.053 | 106.45 | 106.494 |
| 97.8337671997025 | 1.351 | 2.051 | 106.484 | 106.528 |
| 98.00111565637785 | 1.335 | 2.043 | 106.507 | 106.55 |
| 98.16846411305319 | 1.314 | 2.057 | 106.509 | 106.553 |
| 98.33581256972855 | 1.295 | 2.073 | 106.52 | 106.564 |
| 98.50316102640389 | 1.284 | 2.078 | 106.515 | 106.56 |
| 98.67050948307921 | 1.299 | 2.097 | 106.548 | 106.593 |
| 98.83785793975456 | 1.334 | 2.136 | 106.593 | 106.639 |
| 99.0052063964299 | 1.342 | 2.148 | 106.596 | 106.644 |
| 99.17255485310525 | 1.346 | 2.157 | 106.591 | 106.639 |
| 99.33060617329863 | 1.348 | 2.164 | 106.579 | 106.627 |
| 99.49795462997399 | 1.362 | 2.164 | 106.567 | 106.616 |
| 99.66530308664933 | 1.341 | 2.131 | 106.531 | 106.579 |
| 99.83265154332467 | 1.3 | 2.113 | 106.528 | 106.575 |
| 100.0 | 1.292 | 2.125 | 106.528 | 106.574 |